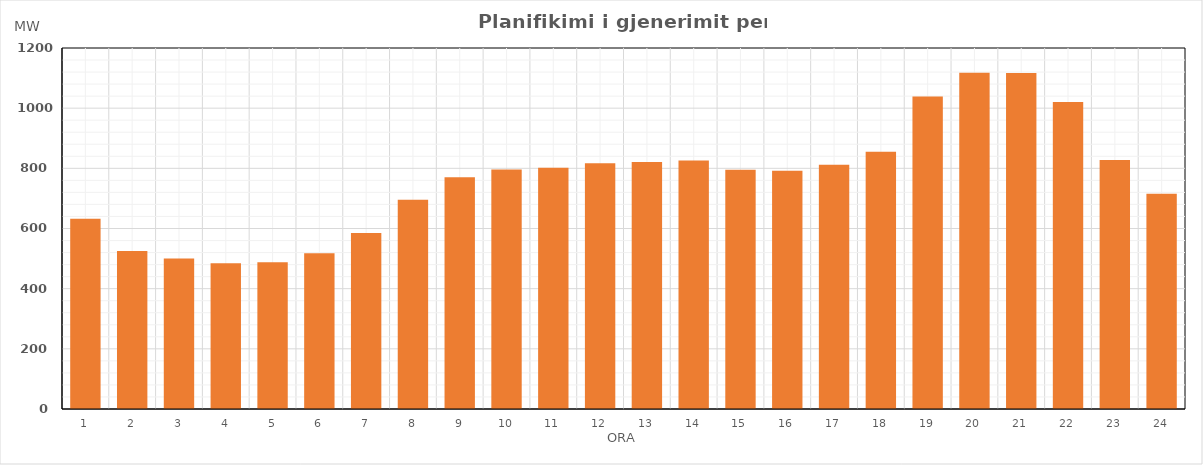
| Category | Max (MW) |
|---|---|
| 0 | 632.55 |
| 1 | 525.25 |
| 2 | 500.16 |
| 3 | 484.74 |
| 4 | 488.03 |
| 5 | 517.32 |
| 6 | 585.41 |
| 7 | 695.75 |
| 8 | 770.26 |
| 9 | 796.35 |
| 10 | 802.27 |
| 11 | 816.85 |
| 12 | 821.21 |
| 13 | 826.21 |
| 14 | 795.7 |
| 15 | 792.28 |
| 16 | 812.19 |
| 17 | 854.78 |
| 18 | 1038.78 |
| 19 | 1117.5 |
| 20 | 1117.17 |
| 21 | 1020.66 |
| 22 | 827.57 |
| 23 | 715.88 |